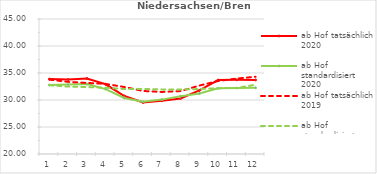
| Category | ab Hof tatsächlich 2020 | ab Hof standardisiert 2020 | ab Hof tatsächlich 2019 | ab Hof standardisiert 2019 |
|---|---|---|---|---|
| 0 | 33.879 | 32.777 | 33.768 | 32.735 |
| 1 | 33.793 | 32.856 | 33.364 | 32.483 |
| 2 | 33.988 | 32.945 | 33.16 | 32.402 |
| 3 | 32.909 | 32.024 | 32.982 | 32.278 |
| 4 | 30.729 | 30.376 | 32.405 | 32.034 |
| 5 | 29.53 | 29.667 | 31.67 | 32.042 |
| 6 | 29.857 | 30.072 | 31.491 | 31.953 |
| 7 | 30.288 | 30.694 | 31.65 | 31.952 |
| 8 | 31.777 | 31.201 | 32.67 | 32.031 |
| 9 | 33.695 | 32.153 | 33.521 | 32.193 |
| 10 | 33.734 | 32.2 | 33.969 | 32.208 |
| 11 | 33.715 | 32.251 | 34.309 | 32.843 |